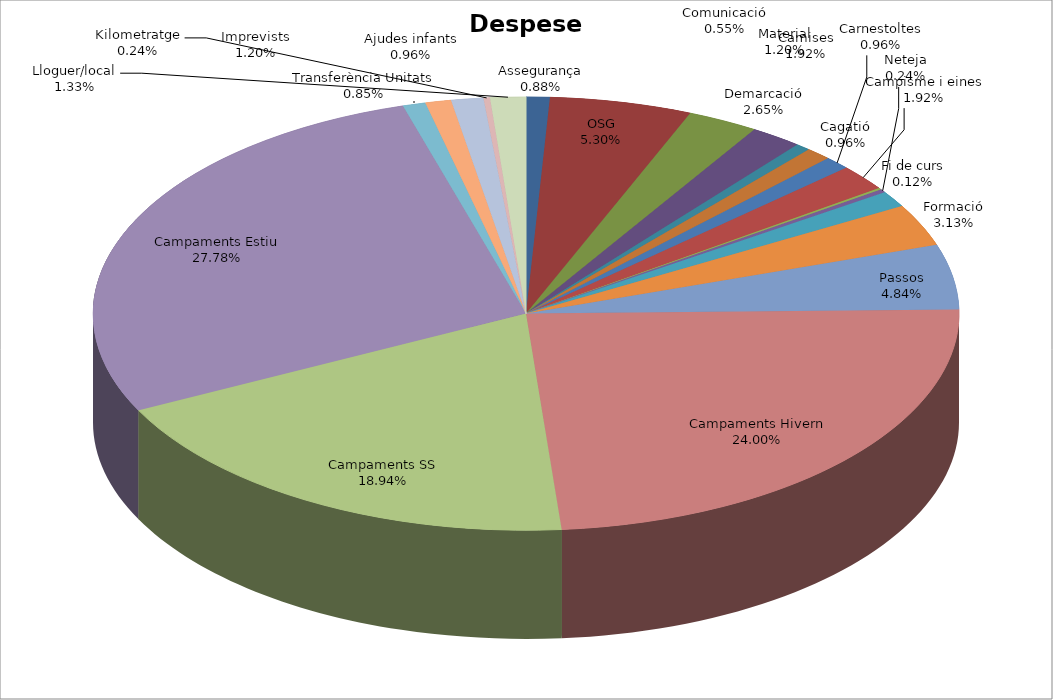
| Category | Series 0 |
|---|---|
| Assegurança | 366.45 |
| OSG | 2205 |
| Demarcació | 1102.5 |
| Camises | 800 |
| Comunicació | 230 |
| Cagatió | 400 |
| Carnestoltes | 400 |
| Campisme i eines | 800 |
| Fi de curs | 50 |
| Neteja | 100 |
| Material | 500 |
| Formació | 1300 |
| Passos | 2010 |
| Campaments Hivern | 9975 |
| Campaments SS | 7875 |
| Campaments Estiu | 11550 |
| Transferència Unitats | 354 |
| Ajudes infants | 400 |
| Imprevists | 500 |
| Kilometratge | 100 |
| Lloguer/local | 552.05 |